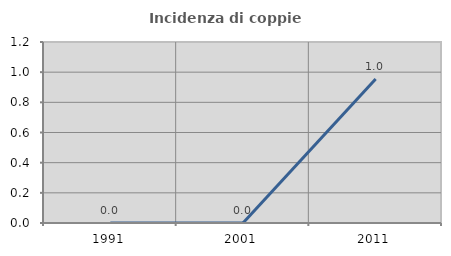
| Category | Incidenza di coppie miste |
|---|---|
| 1991.0 | 0 |
| 2001.0 | 0 |
| 2011.0 | 0.954 |